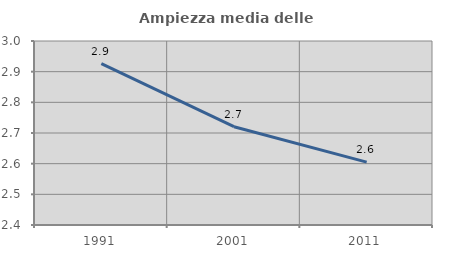
| Category | Ampiezza media delle famiglie |
|---|---|
| 1991.0 | 2.926 |
| 2001.0 | 2.72 |
| 2011.0 | 2.605 |